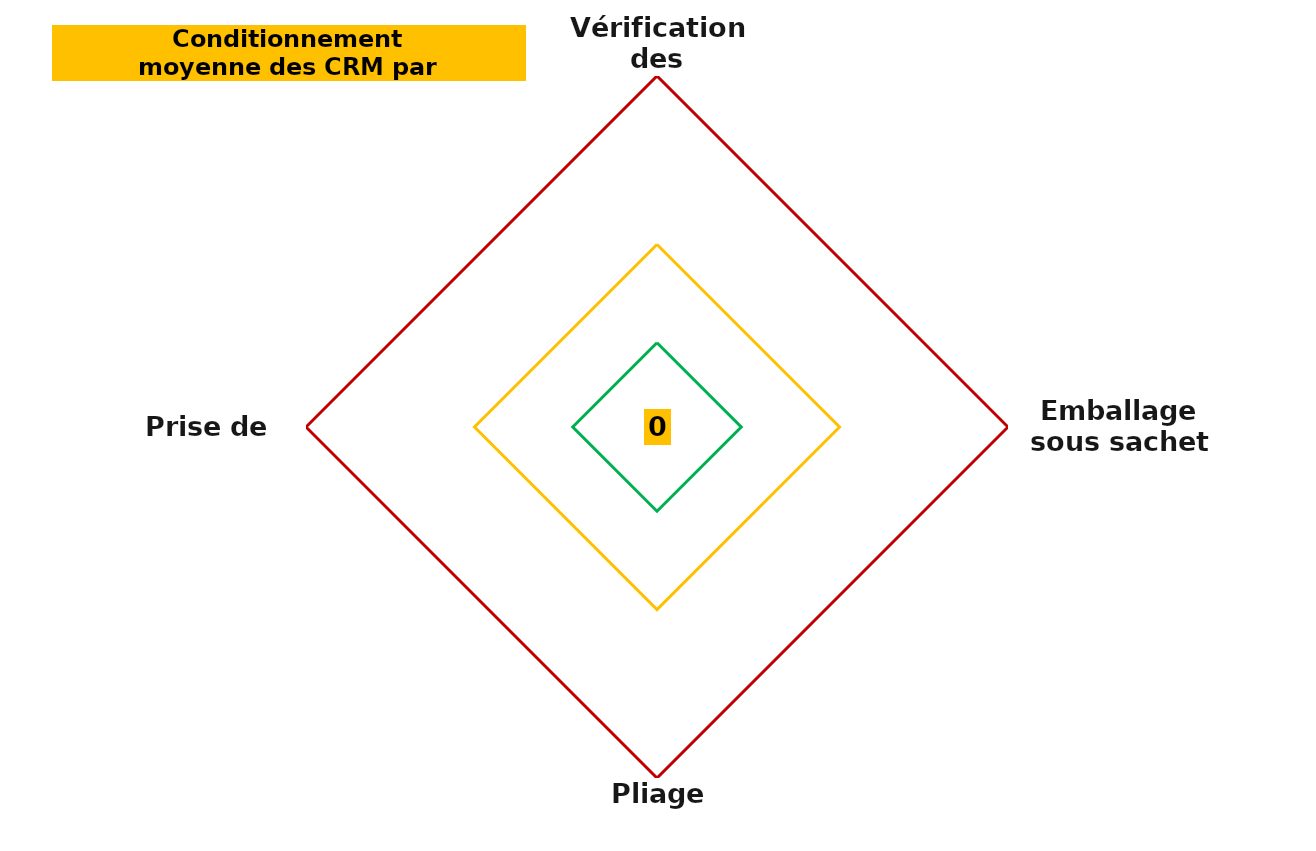
| Category | Series 0 | Series 1 | Series 2 | Series 3 |
|---|---|---|---|---|
| Vérification des conteneurs | 0 | 6 | 13 | 25 |
| Emballage sous sachet | 0 | 6 | 13 | 25 |
| Pliage SMS | 0 | 6 | 13 | 25 |
| Prise de poste | 0 | 6 | 13 | 25 |